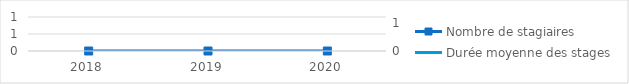
| Category | Nombre de stagiaires |
|---|---|
| 2018.0 | 0 |
| 2019.0 | 0 |
| 2020.0 | 0 |